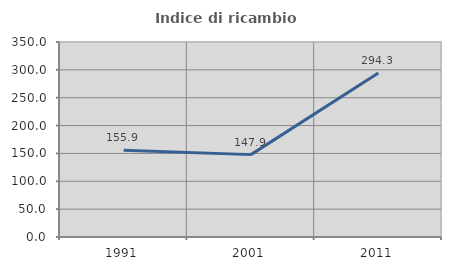
| Category | Indice di ricambio occupazionale  |
|---|---|
| 1991.0 | 155.882 |
| 2001.0 | 147.851 |
| 2011.0 | 294.34 |